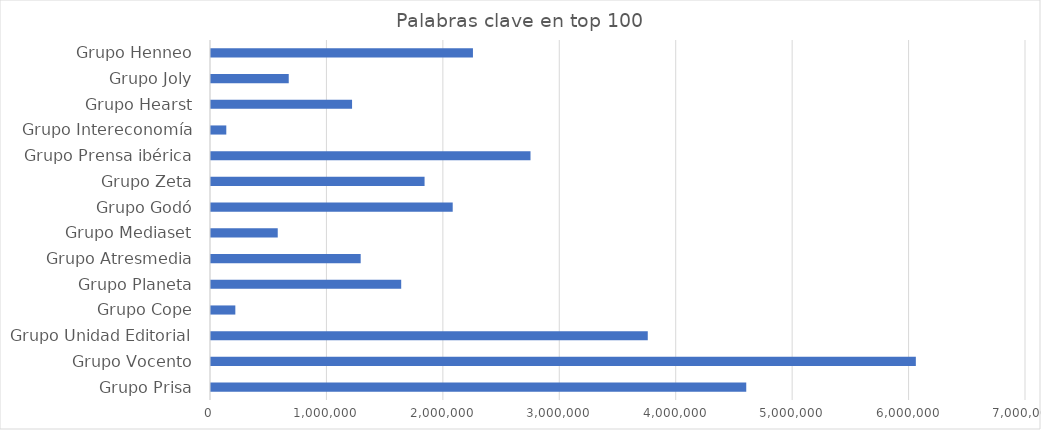
| Category | Palabras clave en top 100 |
|---|---|
| Grupo Prisa | 4597245 |
| Grupo Vocento | 6053870 |
| Grupo Unidad Editorial | 3751382 |
| Grupo Cope | 209004 |
| Grupo Planeta | 1633663 |
| Grupo Atresmedia | 1285606 |
| Grupo Mediaset | 573243 |
| Grupo Godó | 2076073 |
| Grupo Zeta | 1834341 |
| Grupo Prensa ibérica | 2744215 |
| Grupo Intereconomía | 131350 |
| Grupo Hearst | 1211603 |
| Grupo Joly | 667721 |
| Grupo Henneo | 2249848 |